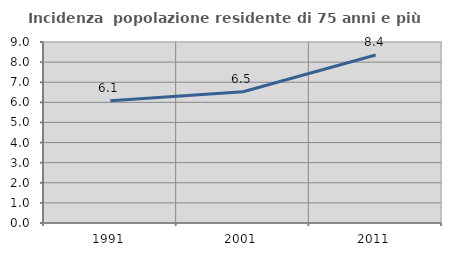
| Category | Incidenza  popolazione residente di 75 anni e più |
|---|---|
| 1991.0 | 6.075 |
| 2001.0 | 6.526 |
| 2011.0 | 8.357 |